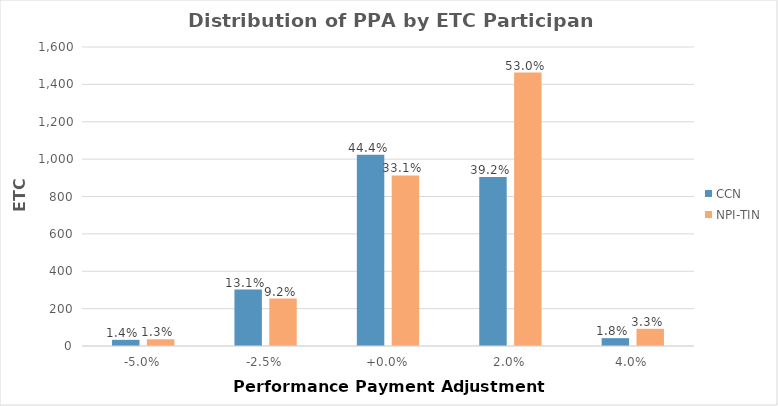
| Category | CCN | NPI-TIN |
|---|---|---|
| -5.0% | 33 | 36 |
| -2.5% | 302 | 254 |
| +0.0% | 1024 | 913 |
| 2.0% | 905 | 1463 |
| 4.0% | 42 | 92 |